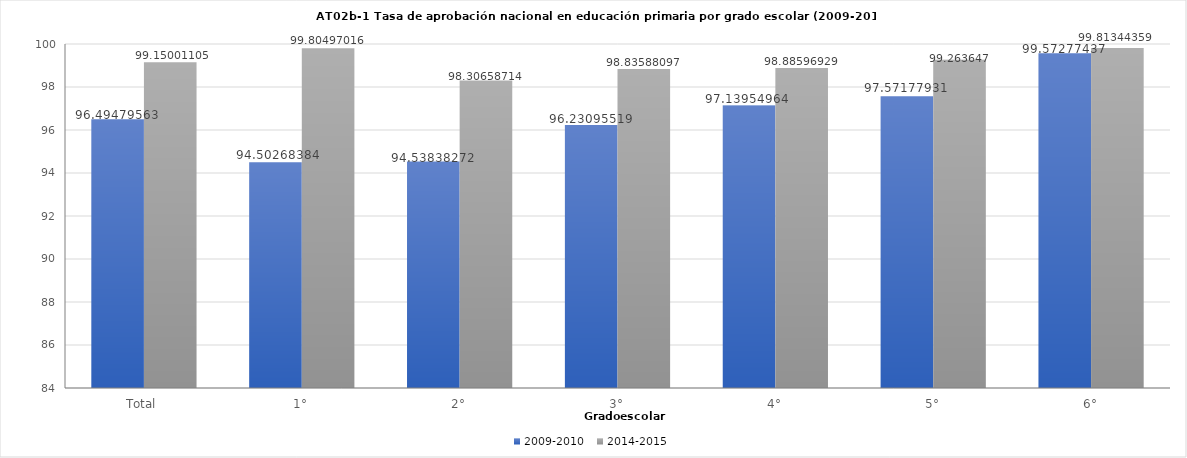
| Category | 2009-2010 | 2014-2015 |
|---|---|---|
| Total | 96.495 | 99.15 |
| 1° | 94.503 | 99.805 |
| 2° | 94.538 | 98.307 |
| 3° | 96.231 | 98.836 |
| 4° | 97.14 | 98.886 |
| 5° | 97.572 | 99.264 |
| 6° | 99.573 | 99.813 |